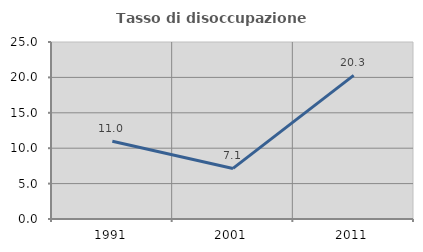
| Category | Tasso di disoccupazione giovanile  |
|---|---|
| 1991.0 | 10.972 |
| 2001.0 | 7.143 |
| 2011.0 | 20.29 |